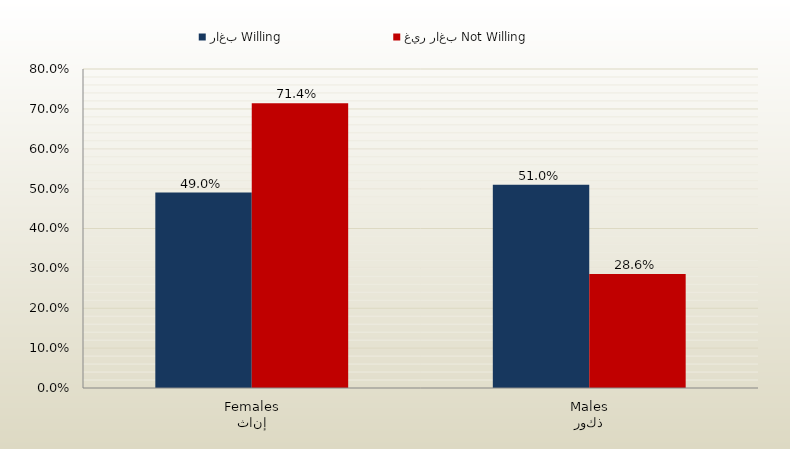
| Category | راغب Willing | غير راغب Not Willing |
|---|---|---|
| إناث
Females | 0.49 | 0.714 |
| ذكور
Males | 0.51 | 0.286 |